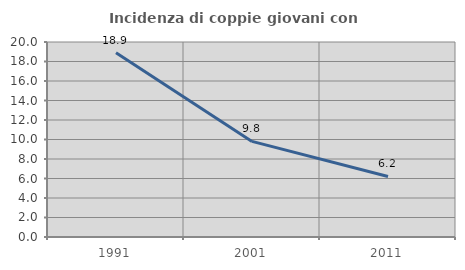
| Category | Incidenza di coppie giovani con figli |
|---|---|
| 1991.0 | 18.906 |
| 2001.0 | 9.806 |
| 2011.0 | 6.208 |